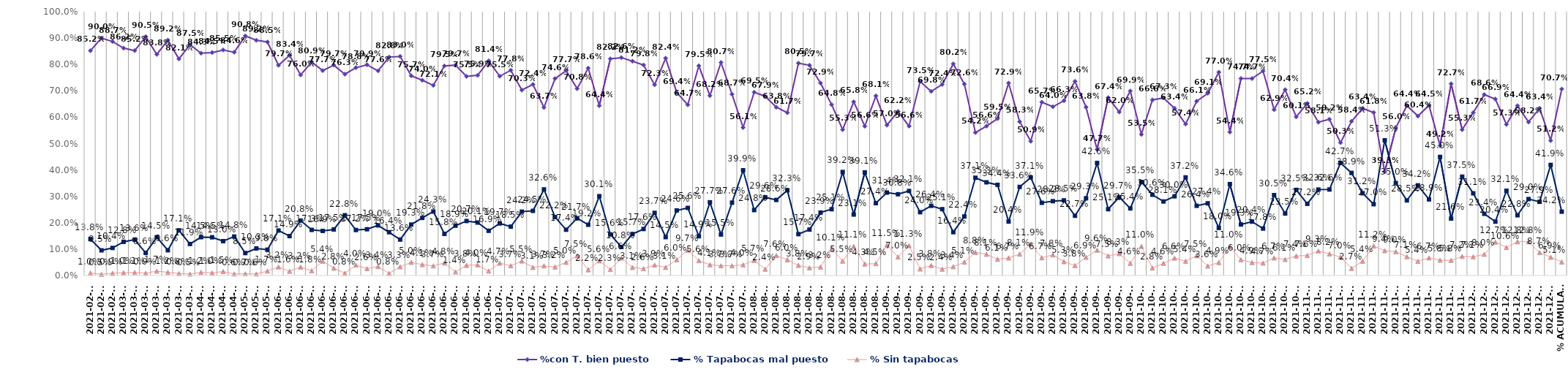
| Category | %con T. bien puesto | % Tapabocas mal puesto | % Sin tapabocas |
|---|---|---|---|
| 2021-02-19 | 0.852 | 0.138 | 0.01 |
| 2021-02-23 | 0.9 | 0.095 | 0.005 |
| 2021-02-25 | 0.887 | 0.104 | 0.009 |
| 2021-03-04 | 0.862 | 0.128 | 0.01 |
| 2021-03-05 | 0.852 | 0.136 | 0.011 |
| 2021-03-10 | 0.905 | 0.086 | 0.009 |
| 2021-03-11 | 0.838 | 0.145 | 0.017 |
| 2021-03-12 | 0.892 | 0.096 | 0.012 |
| 2021-03-29 | 0.821 | 0.171 | 0.008 |
| 2021-03-30 | 0.875 | 0.119 | 0.005 |
| 2021-04-06 | 0.843 | 0.145 | 0.012 |
| 2021-04-07 | 0.845 | 0.145 | 0.01 |
| 2021-04-15 | 0.855 | 0.13 | 0.015 |
| 2021-04-20 | 0.846 | 0.148 | 0.006 |
| 2021-05-04 | 0.908 | 0.085 | 0.007 |
| 2021-05-07 | 0.892 | 0.103 | 0.006 |
| 2021-05-21 | 0.885 | 0.098 | 0.017 |
| 2021-06-01 | 0.797 | 0.171 | 0.032 |
| 2021-06-03 | 0.834 | 0.149 | 0.016 |
| 2021-06-04 | 0.76 | 0.208 | 0.032 |
| 2021-06-08 | 0.809 | 0.173 | 0.018 |
| 2021-06-10 | 0.777 | 0.169 | 0.054 |
| 2021-06-11 | 0.797 | 0.175 | 0.028 |
| 2021-06-12 | 0.763 | 0.228 | 0.008 |
| 2021-06-15 | 0.788 | 0.172 | 0.04 |
| 2021-06-16 | 0.799 | 0.175 | 0.026 |
| 2021-06-17 | 0.776 | 0.19 | 0.034 |
| 2021-06-18 | 0.828 | 0.164 | 0.008 |
| 2021-06-19 | 0.83 | 0.136 | 0.033 |
| 2021-06-21 | 0.757 | 0.193 | 0.05 |
| 2021-06-22 | 0.74 | 0.218 | 0.041 |
| 2021-06-23 | 0.721 | 0.243 | 0.037 |
| 2021-06-24 | 0.795 | 0.158 | 0.048 |
| 2021-06-25 | 0.797 | 0.189 | 0.014 |
| 2021-06-26 | 0.755 | 0.207 | 0.038 |
| 2021-06-29 | 0.759 | 0.201 | 0.04 |
| 2021-06-30 | 0.814 | 0.169 | 0.017 |
| 2021-07-01 | 0.755 | 0.197 | 0.047 |
| 2021-07-02 | 0.778 | 0.185 | 0.037 |
| 2021-07-03 | 0.703 | 0.242 | 0.055 |
| 2021-07-06 | 0.724 | 0.245 | 0.031 |
| 2021-07-07 | 0.637 | 0.326 | 0.037 |
| 2021-07-08 | 0.746 | 0.222 | 0.032 |
| 2021-07-09 | 0.777 | 0.174 | 0.05 |
| 2021-07-10 | 0.708 | 0.217 | 0.075 |
| 2021-07-12 | 0.786 | 0.192 | 0.022 |
| 2021-07-13 | 0.644 | 0.301 | 0.056 |
| 2021-07-14 | 0.822 | 0.156 | 0.023 |
| 2021-07-15 | 0.826 | 0.108 | 0.066 |
| 2021-07-16 | 0.812 | 0.157 | 0.031 |
| 2021-07-17 | 0.798 | 0.176 | 0.026 |
| 2021-07-19 | 0.723 | 0.237 | 0.039 |
| 2021-07-21 | 0.824 | 0.145 | 0.031 |
| 2021-07-22 | 0.694 | 0.246 | 0.06 |
| 2021-07-23 | 0.647 | 0.256 | 0.097 |
| 2021-07-24 | 0.795 | 0.149 | 0.056 |
| 2021-07-28 | 0.682 | 0.277 | 0.041 |
| 2021-07-29 | 0.807 | 0.155 | 0.037 |
| 2021-07-30 | 0.687 | 0.276 | 0.037 |
| 2021-07-31 | 0.561 | 0.399 | 0.04 |
| 2021-08-03 | 0.695 | 0.248 | 0.057 |
| 2021-08-04 | 0.679 | 0.296 | 0.024 |
| 2021-08-05 | 0.638 | 0.286 | 0.076 |
| 2021-08-06 | 0.617 | 0.323 | 0.06 |
| 2021-08-12 | 0.805 | 0.157 | 0.038 |
| 2021-08-17 | 0.797 | 0.174 | 0.029 |
| 2021-08-18 | 0.729 | 0.239 | 0.032 |
| 2021-08-19 | 0.648 | 0.251 | 0.101 |
| 2021-08-20 | 0.553 | 0.392 | 0.055 |
| 2021-08-28 | 0.658 | 0.231 | 0.111 |
| 2021-08-30 | 0.566 | 0.391 | 0.043 |
| 2021-08-31 | 0.681 | 0.274 | 0.045 |
| 2021-09-01 | 0.57 | 0.314 | 0.115 |
| 2021-09-02 | 0.622 | 0.308 | 0.07 |
| 2021-09-03 | 0.566 | 0.321 | 0.113 |
| 2021-09-04 | 0.735 | 0.24 | 0.025 |
| 2021-09-06 | 0.698 | 0.264 | 0.038 |
| 2021-09-08 | 0.724 | 0.251 | 0.024 |
| 2021-09-10 | 0.802 | 0.164 | 0.034 |
| 2021-09-13 | 0.726 | 0.224 | 0.051 |
| 2021-09-14 | 0.542 | 0.371 | 0.088 |
| 2021-09-15 | 0.566 | 0.353 | 0.081 |
| 2021-09-16 | 0.595 | 0.344 | 0.061 |
| 2021-09-17 | 0.729 | 0.204 | 0.067 |
| 2021-09-18 | 0.583 | 0.336 | 0.081 |
| 2021-09-20 | 0.509 | 0.371 | 0.119 |
| 2021-09-21 | 0.657 | 0.276 | 0.067 |
| 2021-09-22 | 0.64 | 0.282 | 0.078 |
| 2021-09-23 | 0.663 | 0.285 | 0.053 |
| 2021-09-24 | 0.736 | 0.227 | 0.038 |
| 2021-09-25 | 0.638 | 0.293 | 0.069 |
| 2021-09-27 | 0.477 | 0.426 | 0.096 |
| 2021-09-28 | 0.674 | 0.251 | 0.075 |
| 2021-09-29 | 0.62 | 0.297 | 0.083 |
| 2021-09-30 | 0.699 | 0.254 | 0.046 |
| 2021-10-01 | 0.535 | 0.355 | 0.11 |
| 2021-10-05 | 0.666 | 0.306 | 0.028 |
| 2021-10-06 | 0.673 | 0.281 | 0.046 |
| 2021-10-11 | 0.634 | 0.3 | 0.066 |
| 2021-10-12 | 0.574 | 0.372 | 0.054 |
| 2021-10-13 | 0.661 | 0.264 | 0.075 |
| 2021-10-14 | 0.691 | 0.274 | 0.036 |
| 2021-10-15 | 0.77 | 0.18 | 0.049 |
| 2021-10-16 | 0.544 | 0.346 | 0.11 |
| 2021-10-19 | 0.747 | 0.193 | 0.06 |
| 2021-10-20 | 0.747 | 0.204 | 0.049 |
| 2021-10-22 | 0.775 | 0.178 | 0.047 |
| 2021-10-26 | 0.629 | 0.305 | 0.067 |
| 2021-10-27 | 0.704 | 0.235 | 0.061 |
| 2021-10-28 | 0.601 | 0.325 | 0.074 |
| 2021-11-02 | 0.652 | 0.272 | 0.076 |
| 2021-11-03 | 0.581 | 0.326 | 0.093 |
| 2021-11-06 | 0.592 | 0.326 | 0.082 |
| 2021-11-09 | 0.503 | 0.427 | 0.07 |
| 2021-11-10 | 0.584 | 0.389 | 0.027 |
| 2021-11-12 | 0.634 | 0.312 | 0.054 |
| 2021-11-17 | 0.618 | 0.27 | 0.112 |
| 2021-11-18 | 0.393 | 0.513 | 0.094 |
| 2021-11-19 | 0.56 | 0.35 | 0.09 |
| 2021-11-22 | 0.644 | 0.285 | 0.071 |
| 2021-11-23 | 0.604 | 0.342 | 0.054 |
| 2021-11-24 | 0.645 | 0.289 | 0.067 |
| 2021-11-25 | 0.492 | 0.45 | 0.058 |
| 2021-11-26 | 0.727 | 0.216 | 0.058 |
| 2021-11-29 | 0.553 | 0.375 | 0.072 |
| 2021-12-03 | 0.617 | 0.311 | 0.071 |
| 2021-12-04 | 0.686 | 0.234 | 0.08 |
| 2021-12-07 | 0.669 | 0.204 | 0.127 |
| 2021-12-09 | 0.573 | 0.321 | 0.106 |
| 2021-12-10 | 0.644 | 0.228 | 0.128 |
| 2021-12-11 | 0.582 | 0.29 | 0.128 |
| 2021-12-13 | 0.634 | 0.279 | 0.087 |
| 2021-12-14 | 0.512 | 0.419 | 0.069 |
| % Acumulado | 0.707 | 0.242 | 0.051 |